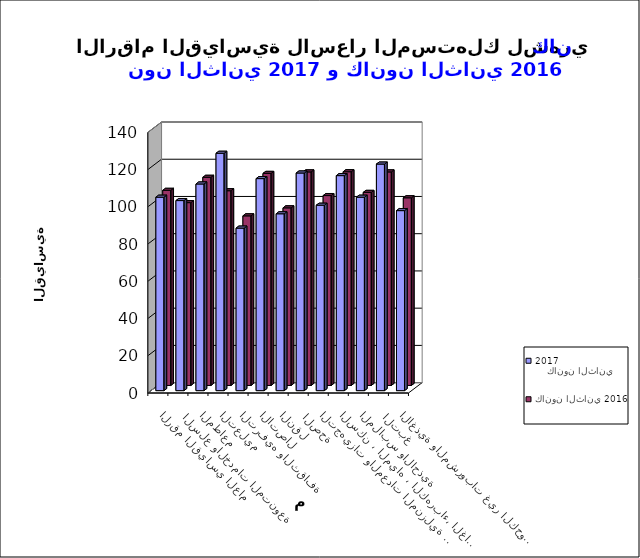
| Category |     كانون الثاني 2017      | كانون الثاني 2016 |
|---|---|---|
| الاغذية والمشروبات غير الكحولية | 96.7 | 100.8 |
|  التبغ | 121.7 | 114.7 |
| الملابس والاحذية | 103.9 | 103.7 |
| السكن ، المياه ، الكهرباء، الغاز  | 115.5 | 114.8 |
| التجهيزات والمعدات المنزلية والصيانة | 99.6 | 102 |
|  الصحة | 116.9 | 114.7 |
| النقل | 95 | 95.4 |
| الاتصال | 113.9 | 113.9 |
| الترفيه والثقافة | 87.3 | 91.1 |
| التعليم | 127.5 | 104.6 |
| المطاعم  | 111 | 111.8 |
|  السلع والخدمات المتنوعة | 102.1 | 98.2 |
| الرقم القياسي العام | 103.9 | 104.8 |